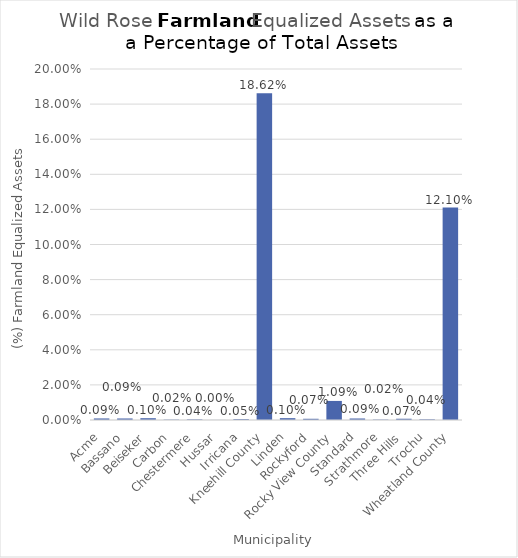
| Category | Farmland Equalized Assets |
|---|---|
| Acme | 0.001 |
| Bassano | 0.001 |
| Beiseker | 0.001 |
| Carbon | 0 |
| Chestermere | 0 |
| Hussar | 0 |
| Irricana | 0.001 |
| Kneehill County | 0.186 |
| Linden | 0.001 |
| Rockyford | 0.001 |
| Rocky View County | 0.011 |
| Standard | 0.001 |
| Strathmore | 0 |
| Three Hills | 0.001 |
| Trochu | 0 |
| Wheatland County | 0.121 |